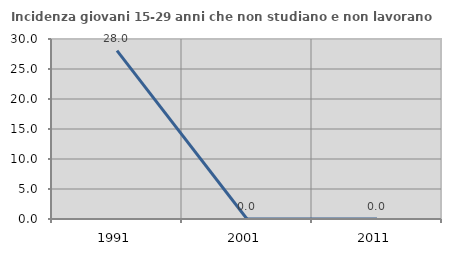
| Category | Incidenza giovani 15-29 anni che non studiano e non lavorano  |
|---|---|
| 1991.0 | 28.049 |
| 2001.0 | 0 |
| 2011.0 | 0 |